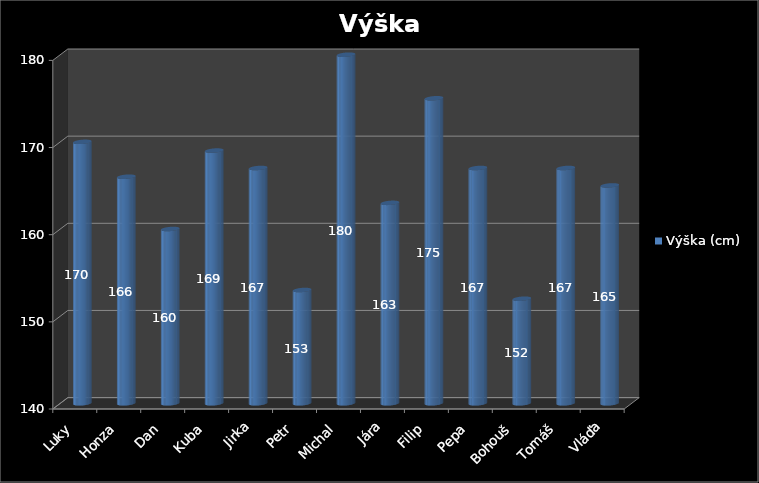
| Category | Výška (cm) |
|---|---|
| Luky | 170 |
| Honza | 166 |
| Dan | 160 |
| Kuba | 169 |
| Jirka | 167 |
| Petr | 153 |
| Michal | 180 |
| Jára | 163 |
| Filip | 175 |
| Pepa | 167 |
| Bohouš | 152 |
| Tomáš | 167 |
| Vláďa | 165 |